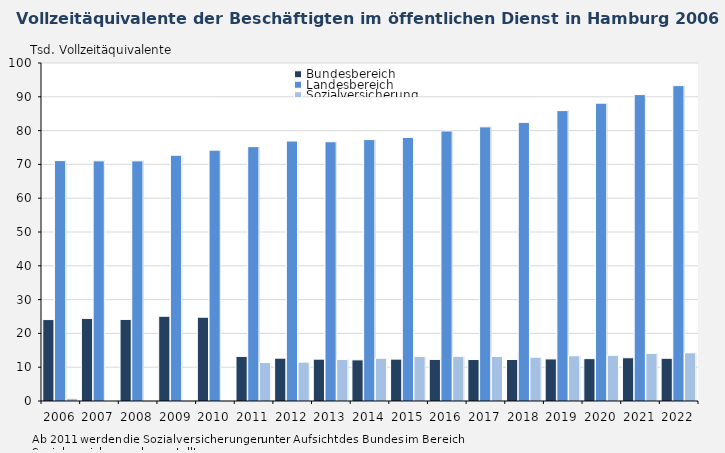
| Category | Bundesbereich | Landesbereich | Sozialversicherung |
|---|---|---|---|
| 2006.0 | 24.091 | 71.132 | 0.792 |
| 2007.0 | 24.443 | 71.054 | 0.075 |
| 2008.0 | 24.137 | 71.045 | 0 |
| 2009.0 | 25.062 | 72.703 | 0 |
| 2010.0 | 24.79 | 74.216 | 0 |
| 2011.0 | 13.19 | 75.256 | 11.372 |
| 2012.0 | 12.669 | 76.923 | 11.495 |
| 2013.0 | 12.379 | 76.705 | 12.284 |
| 2014.0 | 12.173 | 77.353 | 12.643 |
| 2015.0 | 12.39 | 77.981 | 13.156 |
| 2016.0 | 12.303 | 79.896 | 13.21 |
| 2017.0 | 12.272 | 81.109 | 13.178 |
| 2018.0 | 12.278 | 82.429 | 12.946 |
| 2019.0 | 12.448 | 85.922 | 13.384 |
| 2020.0 | 12.535 | 88.115 | 13.505 |
| 2021.0 | 12.793 | 90.656 | 14.084 |
| 2022.0 | 12.64 | 93.31 | 14.255 |